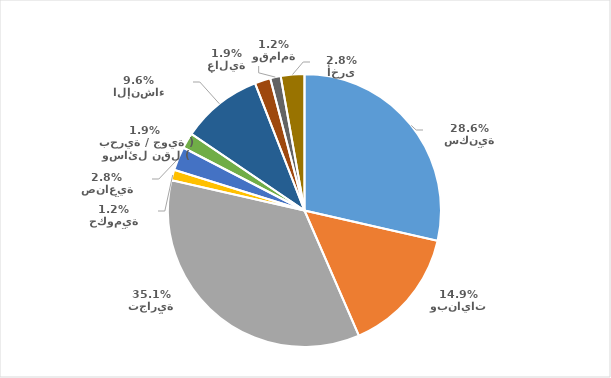
| Category | Series 0 |
|---|---|
| منشآت سكنية | 92 |
| شقق وبنايات | 48 |
| منشآت تجارية | 113 |
| منشآت حكومية | 4 |
| منشآت صناعية | 9 |
| وسائل نقل ( بحرية / جوية ) | 6 |
| مباني قيد الإنشاء | 31 |
| أبراج عالية | 6 |
| نفايات وقمامة | 4 |
| مواقع أخرى | 9 |